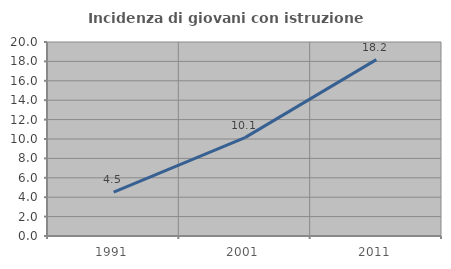
| Category | Incidenza di giovani con istruzione universitaria |
|---|---|
| 1991.0 | 4.534 |
| 2001.0 | 10.145 |
| 2011.0 | 18.182 |